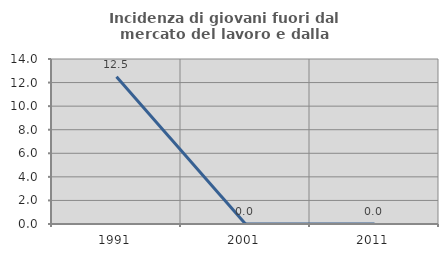
| Category | Incidenza di giovani fuori dal mercato del lavoro e dalla formazione  |
|---|---|
| 1991.0 | 12.5 |
| 2001.0 | 0 |
| 2011.0 | 0 |